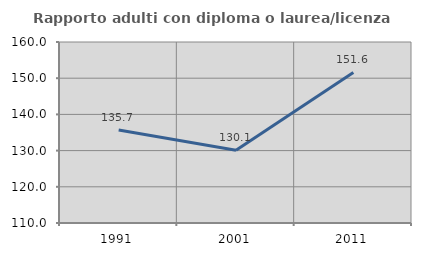
| Category | Rapporto adulti con diploma o laurea/licenza media  |
|---|---|
| 1991.0 | 135.714 |
| 2001.0 | 130.12 |
| 2011.0 | 151.592 |